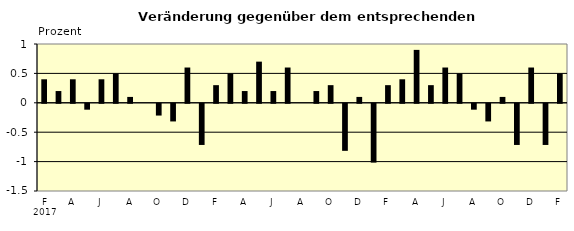
| Category | Series 0 |
|---|---|
| 0 | 0.4 |
| 1 | 0.2 |
| 2 | 0.4 |
| 3 | -0.1 |
| 4 | 0.4 |
| 5 | 0.5 |
| 6 | 0.1 |
| 7 | 0 |
| 8 | -0.2 |
| 9 | -0.3 |
| 10 | 0.6 |
| 11 | -0.7 |
| 12 | 0.3 |
| 13 | 0.5 |
| 14 | 0.2 |
| 15 | 0.7 |
| 16 | 0.2 |
| 17 | 0.6 |
| 18 | 0 |
| 19 | 0.2 |
| 20 | 0.3 |
| 21 | -0.8 |
| 22 | 0.1 |
| 23 | -1 |
| 24 | 0.3 |
| 25 | 0.4 |
| 26 | 0.9 |
| 27 | 0.3 |
| 28 | 0.6 |
| 29 | 0.5 |
| 30 | -0.1 |
| 31 | -0.3 |
| 32 | 0.1 |
| 33 | -0.7 |
| 34 | 0.6 |
| 35 | -0.7 |
| 36 | 0.5 |